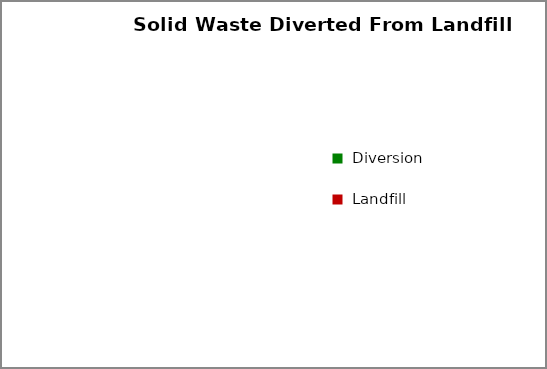
| Category | Series 0 |
|---|---|
| Diversion | 0 |
| Landfill | 0 |